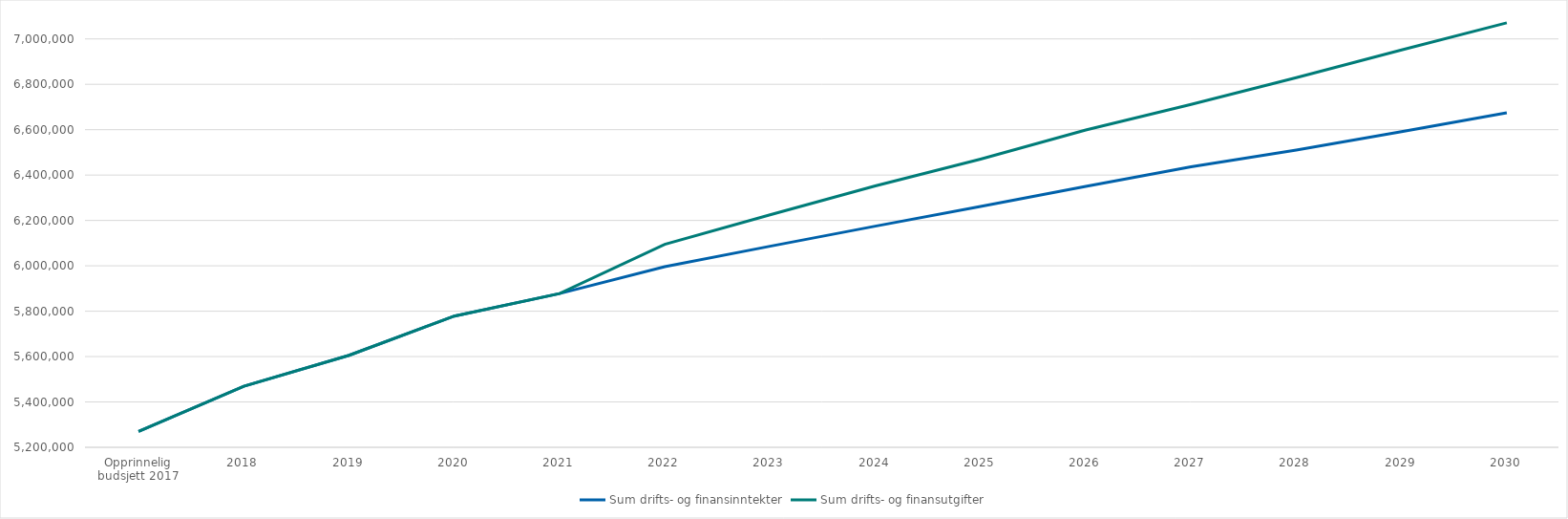
| Category | Sum drifts- og finansinntekter | Sum drifts- og finansutgifter |
|---|---|---|
| Opprinnelig budsjett 2017 | 5270473 | 5270473 |
| 2018 | 5469050 | 5469050 |
| 2019 | 5605544 | 5605544 |
| 2020 | 5778362 | 5778362 |
| 2021 | 5877775 | 5877775 |
| 2022 | 5996092.79 | 6094838.242 |
| 2023 | 6086240.166 | 6224864.96 |
| 2024 | 6174676.266 | 6352442.209 |
| 2025 | 6261341.089 | 6470468.564 |
| 2026 | 6349972.105 | 6598503.896 |
| 2027 | 6436711.845 | 6711501.61 |
| 2028 | 6510107.904 | 6829442.452 |
| 2029 | 6591619.269 | 6951409.618 |
| 2030 | 6674856.826 | 7071082.431 |